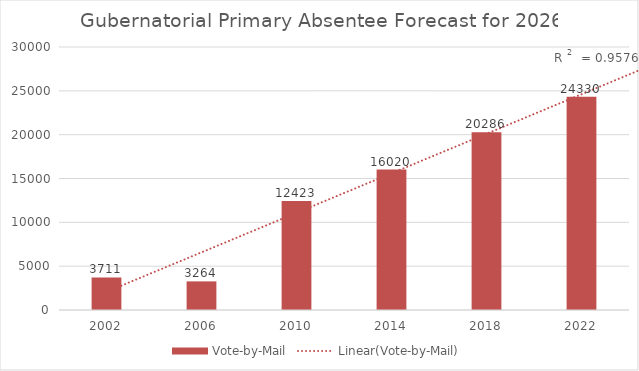
| Category | Vote-by-Mail |
|---|---|
| 2002.0 | 3711 |
| 2006.0 | 3264 |
| 2010.0 | 12423 |
| 2014.0 | 16020 |
| 2018.0 | 20286 |
| 2022.0 | 24330 |